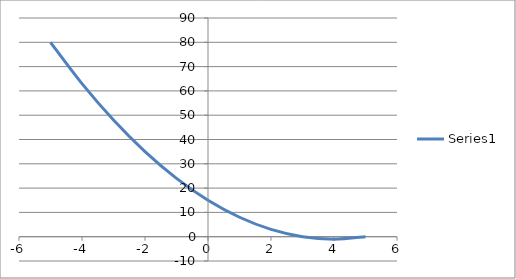
| Category | Series 0 |
|---|---|
| 5.0 | 0 |
| 4.0 | -1 |
| 3.0 | 0 |
| 2.0 | 3 |
| 1.0 | 8 |
| 0.0 | 15 |
| -1.0 | 24 |
| -2.0 | 35 |
| -3.0 | 48 |
| -4.0 | 63 |
| -5.0 | 80 |